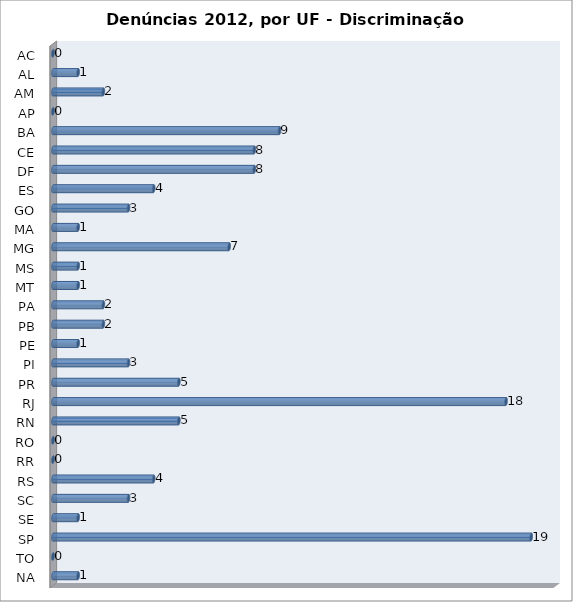
| Category | Series 0 |
|---|---|
| AC | 0 |
| AL | 1 |
| AM | 2 |
| AP | 0 |
| BA | 9 |
| CE | 8 |
| DF | 8 |
| ES | 4 |
| GO | 3 |
| MA | 1 |
| MG | 7 |
| MS | 1 |
| MT | 1 |
| PA | 2 |
| PB | 2 |
| PE | 1 |
| PI | 3 |
| PR | 5 |
| RJ | 18 |
| RN | 5 |
| RO | 0 |
| RR | 0 |
| RS | 4 |
| SC | 3 |
| SE | 1 |
| SP | 19 |
| TO | 0 |
| NA | 1 |